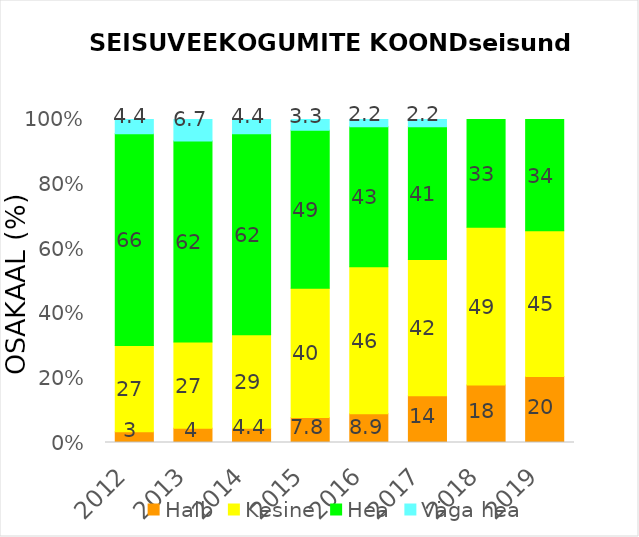
| Category | Halb | Kesine | Hea | Väga hea |
|---|---|---|---|---|
| 2012.0 | 3.333 | 26.667 | 65.556 | 4.444 |
| 2013.0 | 4.444 | 26.667 | 62.222 | 6.667 |
| 2014.0 | 4.444 | 28.889 | 62.222 | 4.444 |
| 2015.0 | 7.778 | 40 | 48.889 | 3.333 |
| 2016.0 | 8.889 | 45.556 | 43.333 | 2.222 |
| 2017.0 | 14.444 | 42.222 | 41.111 | 2.222 |
| 2018.0 | 17.778 | 48.889 | 33.333 | 0 |
| 2019.0 | 20.43 | 45.161 | 34.409 | 0 |